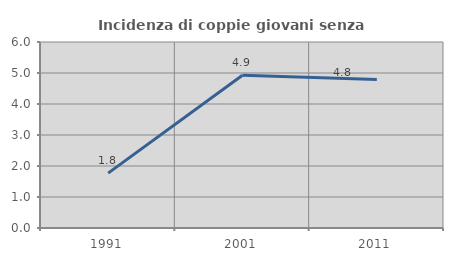
| Category | Incidenza di coppie giovani senza figli |
|---|---|
| 1991.0 | 1.77 |
| 2001.0 | 4.93 |
| 2011.0 | 4.787 |